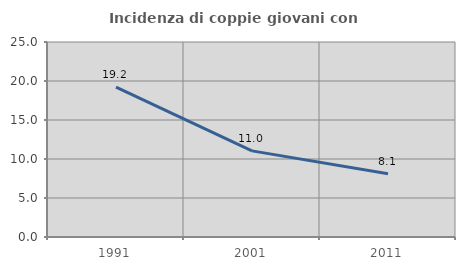
| Category | Incidenza di coppie giovani con figli |
|---|---|
| 1991.0 | 19.221 |
| 2001.0 | 11.04 |
| 2011.0 | 8.12 |